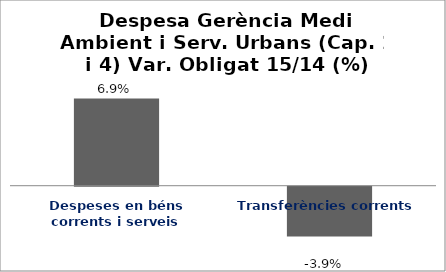
| Category | Series 0 |
|---|---|
| Despeses en béns corrents i serveis | 0.069 |
| Transferències corrents | -0.039 |